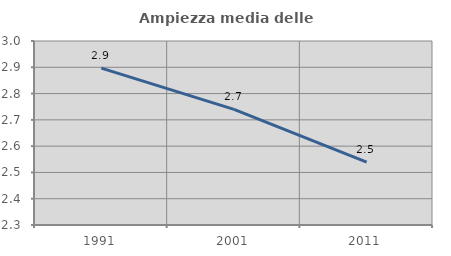
| Category | Ampiezza media delle famiglie |
|---|---|
| 1991.0 | 2.897 |
| 2001.0 | 2.74 |
| 2011.0 | 2.539 |